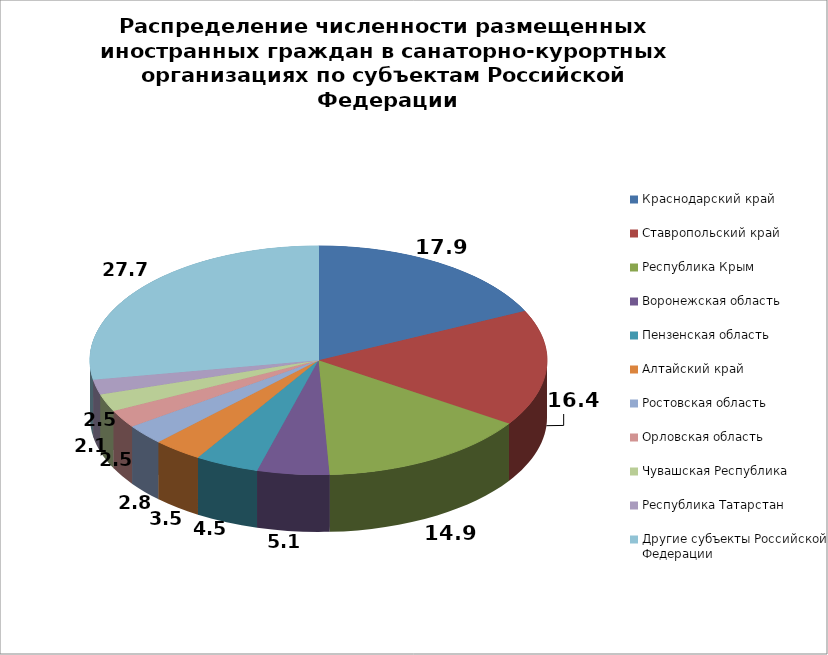
| Category | Series 0 |
|---|---|
| Краснодарский край | 17.892 |
| Ставропольский край | 16.44 |
| Республика Крым | 14.899 |
| Воронежская область | 5.092 |
| Пензенская область | 4.519 |
| Алтайский край | 3.494 |
| Ростовская область | 2.823 |
| Орловская область | 2.533 |
| Чувашская Республика | 2.468 |
| Республика Татарстан | 2.108 |
| Другие субъекты Российской Федерации | 27.732 |